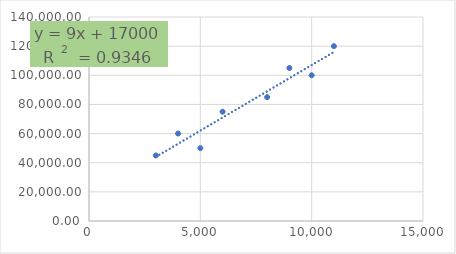
| Category | Series 0 |
|---|---|
| 5000.0 | 50000 |
| 3000.0 | 45000 |
| 4000.0 | 60000 |
| 6000.0 | 75000 |
| 10000.0 | 100000 |
| 9000.0 | 105000 |
| 8000.0 | 85000 |
| 11000.0 | 120000 |